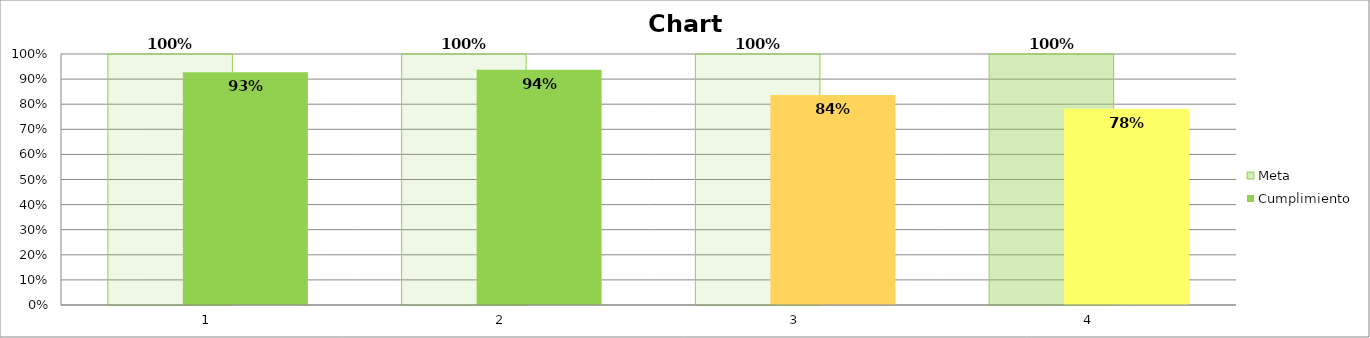
| Category | Meta | Cumplimiento |
|---|---|---|
| 0 | 1 | 0.927 |
| 1 | 1 | 0.937 |
| 2 | 1 | 0.837 |
| 3 | 1 | 0.782 |